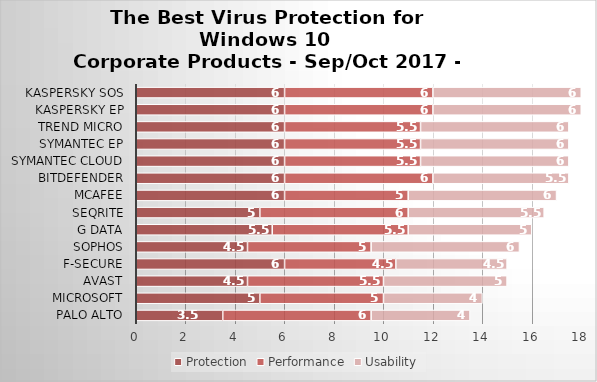
| Category | Protection | Performance | Usability |
|---|---|---|---|
| Palo Alto | 3.5 | 6 | 4 |
| Microsoft | 5 | 5 | 4 |
| Avast | 4.5 | 5.5 | 5 |
| F-Secure | 6 | 4.5 | 4.5 |
| Sophos | 4.5 | 5 | 6 |
| G Data | 5.5 | 5.5 | 5 |
| Seqrite | 5 | 6 | 5.5 |
| McAfee | 6 | 5 | 6 |
| Bitdefender | 6 | 6 | 5.5 |
| Symantec Cloud | 6 | 5.5 | 6 |
| Symantec EP | 6 | 5.5 | 6 |
| Trend Micro | 6 | 5.5 | 6 |
| Kaspersky EP | 6 | 6 | 6 |
| Kaspersky SOS | 6 | 6 | 6 |